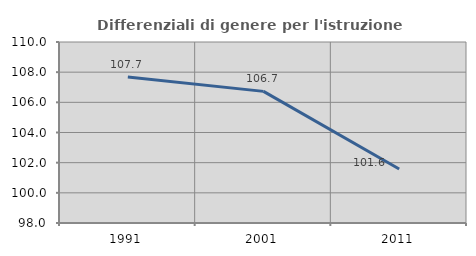
| Category | Differenziali di genere per l'istruzione superiore |
|---|---|
| 1991.0 | 107.686 |
| 2001.0 | 106.726 |
| 2011.0 | 101.578 |